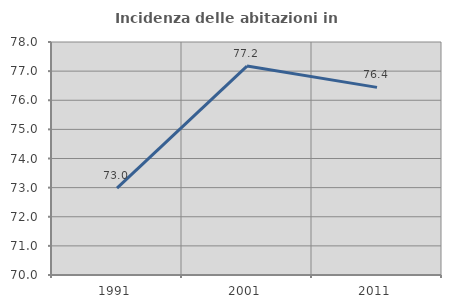
| Category | Incidenza delle abitazioni in proprietà  |
|---|---|
| 1991.0 | 72.984 |
| 2001.0 | 77.172 |
| 2011.0 | 76.442 |